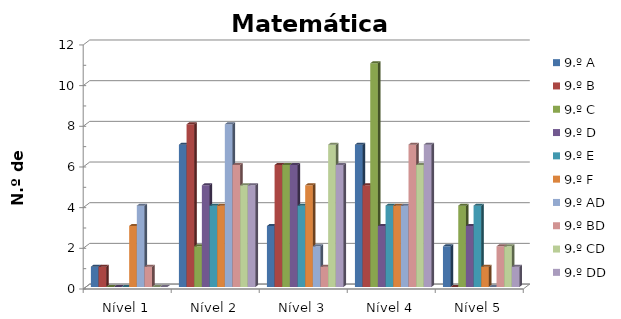
| Category | 9.º A | 9.º B | 9.º C | 9.º D | 9.º E | 9.º F | 9.º AD | 9.º BD | 9.º CD | 9.º DD |
|---|---|---|---|---|---|---|---|---|---|---|
| Nível 1 | 1 | 1 | 0 | 0 | 0 | 3 | 4 | 1 | 0 | 0 |
| Nível 2 | 7 | 8 | 2 | 5 | 4 | 4 | 8 | 6 | 5 | 5 |
| Nível 3 | 3 | 6 | 6 | 6 | 4 | 5 | 2 | 1 | 7 | 6 |
| Nível 4 | 7 | 5 | 11 | 3 | 4 | 4 | 4 | 7 | 6 | 7 |
| Nível 5 | 2 | 0 | 4 | 3 | 4 | 1 | 0 | 2 | 2 | 1 |